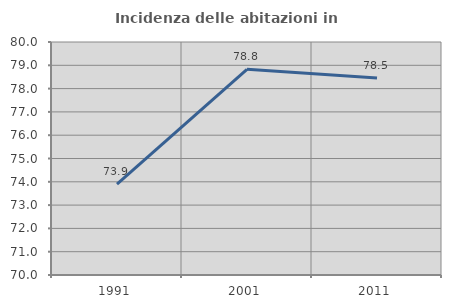
| Category | Incidenza delle abitazioni in proprietà  |
|---|---|
| 1991.0 | 73.901 |
| 2001.0 | 78.826 |
| 2011.0 | 78.456 |